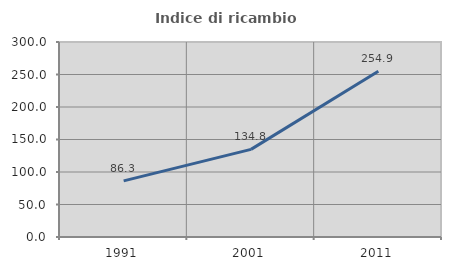
| Category | Indice di ricambio occupazionale  |
|---|---|
| 1991.0 | 86.3 |
| 2001.0 | 134.828 |
| 2011.0 | 254.913 |